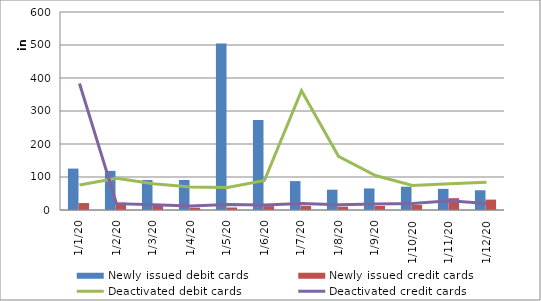
| Category | Newly issued debit cards | Newly issued credit cards |
|---|---|---|
| 1/1/20 | 125521 | 21070 |
| 1/2/20 | 118580 | 22322 |
| 1/3/20 | 90854 | 15744 |
| 1/4/20 | 90861 | 6873 |
| 1/5/20 | 504226 | 7592 |
| 1/6/20 | 272759 | 11711 |
| 1/7/20 | 87539 | 12587 |
| 1/8/20 | 61542 | 10113 |
| 1/9/20 | 65254 | 12160 |
| 1/10/20 | 70548 | 15341 |
| 1/11/20 | 64025 | 35834 |
| 1/12/20 | 59811 | 31501 |